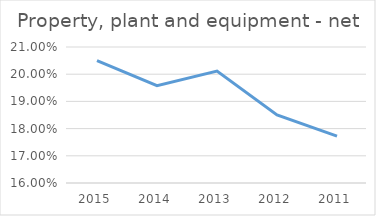
| Category | Property, plant and equipment - net |
|---|---|
| 2015.0 | 0.205 |
| 2014.0 | 0.196 |
| 2013.0 | 0.201 |
| 2012.0 | 0.185 |
| 2011.0 | 0.177 |